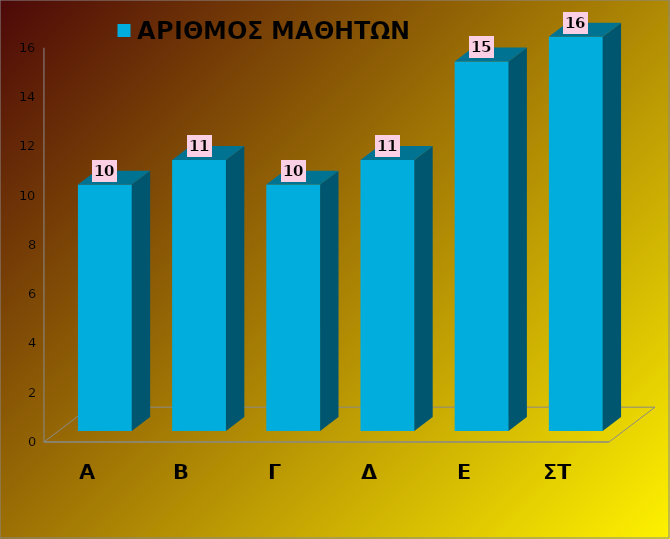
| Category | ΑΡΙΘΜΟΣ ΜΑΘΗΤΩΝ  |
|---|---|
| Α | 10 |
| Β | 11 |
| Γ | 10 |
| Δ | 11 |
| Ε | 15 |
| ΣΤ | 16 |